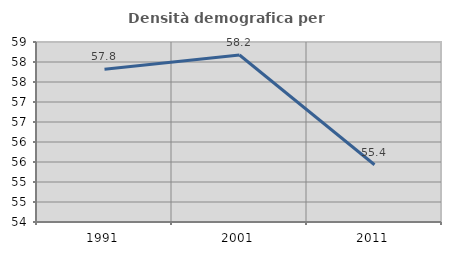
| Category | Densità demografica |
|---|---|
| 1991.0 | 57.82 |
| 2001.0 | 58.176 |
| 2011.0 | 55.432 |